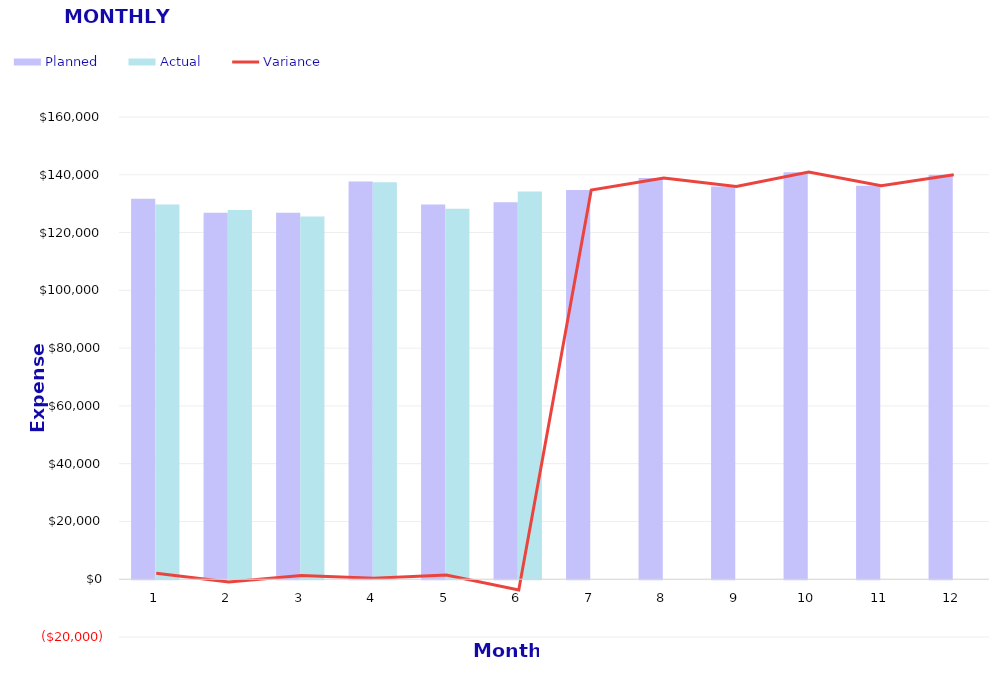
| Category | Planned | Actual |
|---|---|---|
| 0 | 131720 | 129682 |
| 1 | 126820 | 127804 |
| 2 | 126820 | 125565 |
| 3 | 137695 | 137394 |
| 4 | 129695 | 128255 |
| 5 | 130495 | 134239 |
| 6 | 134695 | 0 |
| 7 | 138918 | 0 |
| 8 | 135918 | 0 |
| 9 | 140918 | 0 |
| 10 | 136218 | 0 |
| 11 | 140018 | 0 |